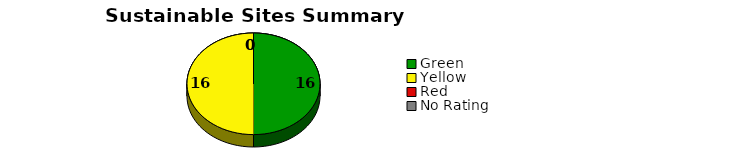
| Category | Series 0 |
|---|---|
| Green | 16 |
| Yellow | 16 |
| Red | 0 |
| No Rating | 0 |